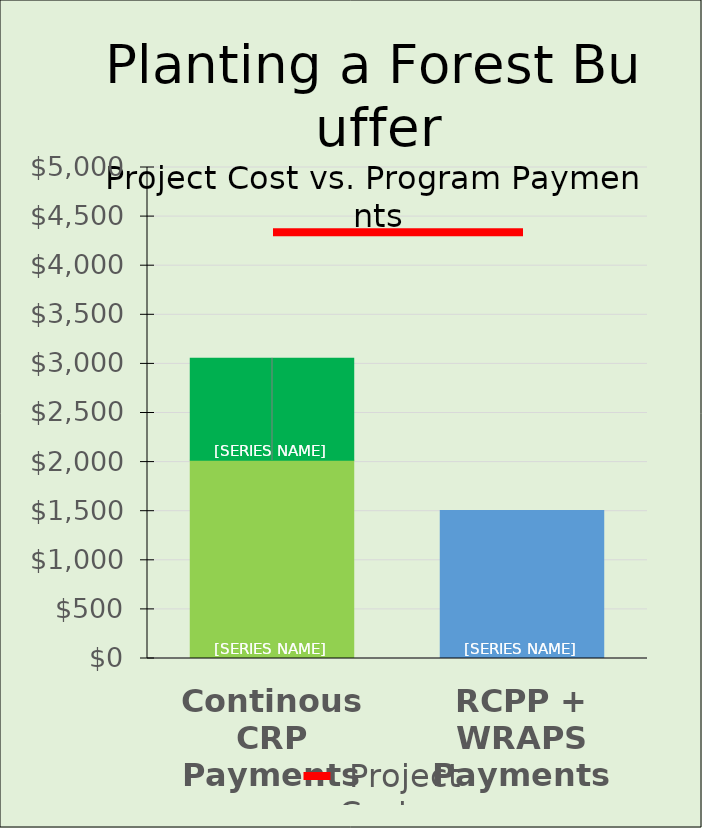
| Category | One-time | Rental | Maintenance |
|---|---|---|---|
| Continous CRP Payments | 2018.448 | 1037.966 | 0 |
| RCPP + WRAPS Payments | 1506.664 | 0 | 0 |